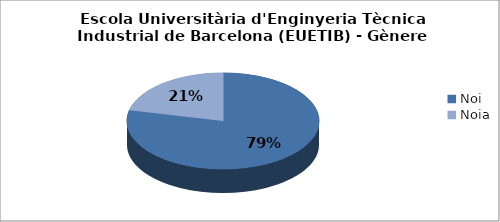
| Category | Escola Universitària d'Enginyeria Tècnica Industrial de Barcelona (EUETIB) - Gènere |
|---|---|
| Noi | 0.786 |
| Noia | 0.214 |